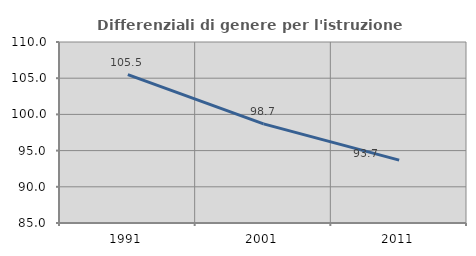
| Category | Differenziali di genere per l'istruzione superiore |
|---|---|
| 1991.0 | 105.502 |
| 2001.0 | 98.692 |
| 2011.0 | 93.681 |